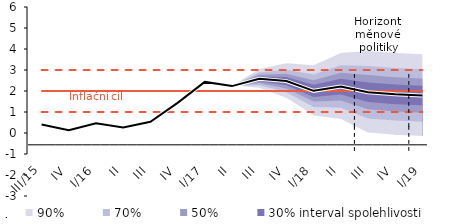
| Category | Inflation Target | Inflation Target - lower bound | Inflation Target - upper bound | linka | Střed předpovědi |
|---|---|---|---|---|---|
| III/15 | 2 | 1 | 3 | 0.4 | 0.4 |
| IV | 2 | 1 | 3 | 0.133 | 0.133 |
| I/16 | 2 | 1 | 3 | 0.467 | 0.467 |
| II | 2 | 1 | 3 | 0.267 | 0.267 |
| III | 2 | 1 | 3 | 0.533 | 0.533 |
| IV | 2 | 1 | 3 | 1.433 | 1.433 |
| I/17 | 2 | 1 | 3 | 2.433 | 2.433 |
| II | 2 | 1 | 3 | 2.233 | 2.233 |
| III | 2 | 1 | 3 | 2.579 | 2.579 |
| IV | 2 | 1 | 3 | 2.472 | 2.472 |
| I/18 | 2 | 1 | 3 | 2.008 | 2.008 |
| II | 2 | 1 | 3 | 2.21 | 2.21 |
| III | 2 | 1 | 3 | 1.942 | 1.942 |
| IV | 2 | 1 | 3 | 1.843 | 1.843 |
| I/19 | 2 | 1 | 3 | 1.785 | 1.785 |